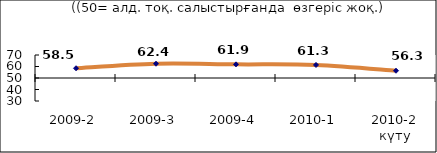
| Category | Диф.индекс ↓ |
|---|---|
| 2009-2 | 58.475 |
| 2009-3 | 62.395 |
| 2009-4 | 61.865 |
| 2010-1 | 61.34 |
| 2010-2 күту | 56.31 |